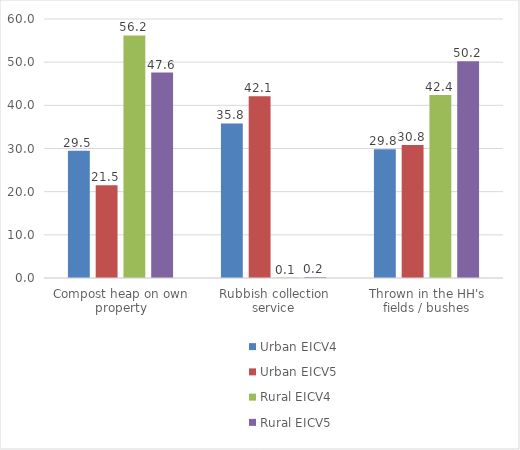
| Category | Urban EICV4 | Urban EICV5 | Rural EICV4 | Rural EICV5 |
|---|---|---|---|---|
| Compost heap on own property | 29.5 | 21.5 | 56.2 | 47.6 |
| Rubbish collection service | 35.8 | 42.1 | 0.1 | 0.2 |
| Thrown in the HH's fields / bushes | 29.8 | 30.8 | 42.4 | 50.2 |